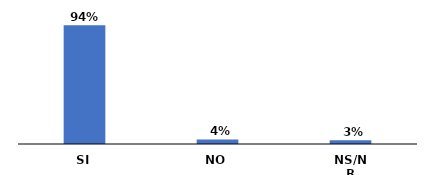
| Category | Series 0 |
|---|---|
| SI | 0.935 |
| NO | 0.036 |
| NS/NR | 0.029 |